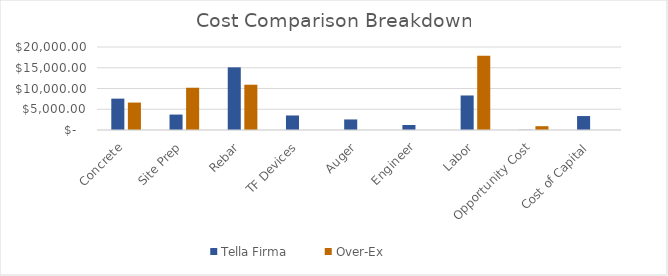
| Category | Tella Firma | Over-Ex |
|---|---|---|
| Concrete | 7560 | 6614.1 |
| Site Prep | 3720 | 10185.202 |
| Rebar | 15098.14 | 10913 |
| TF Devices | 3500 | 0 |
| Auger | 2542 | 0 |
| Engineer | 1200 | 0 |
| Labor | 8320 | 17920 |
| Opportunity Cost | 52.282 | 918.897 |
| Cost of Capital | 3359.394 | 0 |